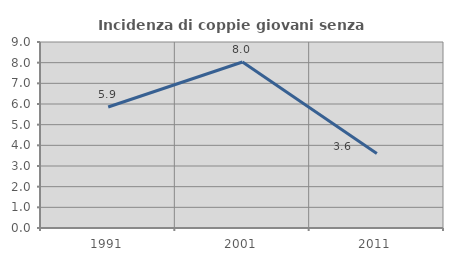
| Category | Incidenza di coppie giovani senza figli |
|---|---|
| 1991.0 | 5.854 |
| 2001.0 | 8.031 |
| 2011.0 | 3.609 |